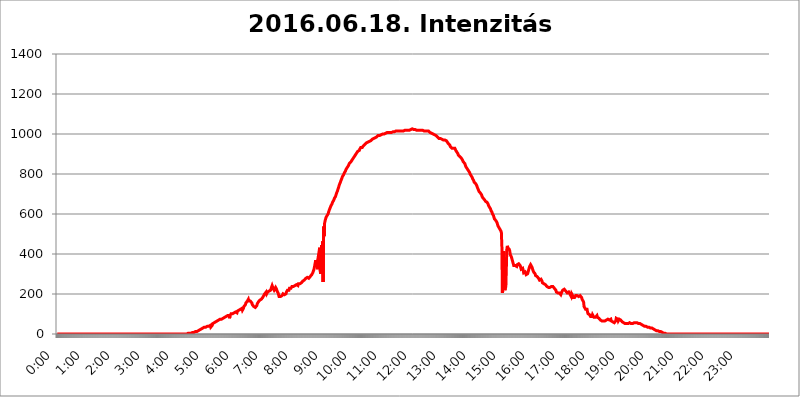
| Category | 2016.06.18. Intenzitás [W/m^2] |
|---|---|
| 0.0 | 0 |
| 0.0006944444444444445 | 0 |
| 0.001388888888888889 | 0 |
| 0.0020833333333333333 | 0 |
| 0.002777777777777778 | 0 |
| 0.003472222222222222 | 0 |
| 0.004166666666666667 | 0 |
| 0.004861111111111111 | 0 |
| 0.005555555555555556 | 0 |
| 0.0062499999999999995 | 0 |
| 0.006944444444444444 | 0 |
| 0.007638888888888889 | 0 |
| 0.008333333333333333 | 0 |
| 0.009027777777777779 | 0 |
| 0.009722222222222222 | 0 |
| 0.010416666666666666 | 0 |
| 0.011111111111111112 | 0 |
| 0.011805555555555555 | 0 |
| 0.012499999999999999 | 0 |
| 0.013194444444444444 | 0 |
| 0.013888888888888888 | 0 |
| 0.014583333333333332 | 0 |
| 0.015277777777777777 | 0 |
| 0.015972222222222224 | 0 |
| 0.016666666666666666 | 0 |
| 0.017361111111111112 | 0 |
| 0.018055555555555557 | 0 |
| 0.01875 | 0 |
| 0.019444444444444445 | 0 |
| 0.02013888888888889 | 0 |
| 0.020833333333333332 | 0 |
| 0.02152777777777778 | 0 |
| 0.022222222222222223 | 0 |
| 0.02291666666666667 | 0 |
| 0.02361111111111111 | 0 |
| 0.024305555555555556 | 0 |
| 0.024999999999999998 | 0 |
| 0.025694444444444447 | 0 |
| 0.02638888888888889 | 0 |
| 0.027083333333333334 | 0 |
| 0.027777777777777776 | 0 |
| 0.02847222222222222 | 0 |
| 0.029166666666666664 | 0 |
| 0.029861111111111113 | 0 |
| 0.030555555555555555 | 0 |
| 0.03125 | 0 |
| 0.03194444444444445 | 0 |
| 0.03263888888888889 | 0 |
| 0.03333333333333333 | 0 |
| 0.034027777777777775 | 0 |
| 0.034722222222222224 | 0 |
| 0.035416666666666666 | 0 |
| 0.036111111111111115 | 0 |
| 0.03680555555555556 | 0 |
| 0.0375 | 0 |
| 0.03819444444444444 | 0 |
| 0.03888888888888889 | 0 |
| 0.03958333333333333 | 0 |
| 0.04027777777777778 | 0 |
| 0.04097222222222222 | 0 |
| 0.041666666666666664 | 0 |
| 0.042361111111111106 | 0 |
| 0.04305555555555556 | 0 |
| 0.043750000000000004 | 0 |
| 0.044444444444444446 | 0 |
| 0.04513888888888889 | 0 |
| 0.04583333333333334 | 0 |
| 0.04652777777777778 | 0 |
| 0.04722222222222222 | 0 |
| 0.04791666666666666 | 0 |
| 0.04861111111111111 | 0 |
| 0.049305555555555554 | 0 |
| 0.049999999999999996 | 0 |
| 0.05069444444444445 | 0 |
| 0.051388888888888894 | 0 |
| 0.052083333333333336 | 0 |
| 0.05277777777777778 | 0 |
| 0.05347222222222222 | 0 |
| 0.05416666666666667 | 0 |
| 0.05486111111111111 | 0 |
| 0.05555555555555555 | 0 |
| 0.05625 | 0 |
| 0.05694444444444444 | 0 |
| 0.057638888888888885 | 0 |
| 0.05833333333333333 | 0 |
| 0.05902777777777778 | 0 |
| 0.059722222222222225 | 0 |
| 0.06041666666666667 | 0 |
| 0.061111111111111116 | 0 |
| 0.06180555555555556 | 0 |
| 0.0625 | 0 |
| 0.06319444444444444 | 0 |
| 0.06388888888888888 | 0 |
| 0.06458333333333334 | 0 |
| 0.06527777777777778 | 0 |
| 0.06597222222222222 | 0 |
| 0.06666666666666667 | 0 |
| 0.06736111111111111 | 0 |
| 0.06805555555555555 | 0 |
| 0.06874999999999999 | 0 |
| 0.06944444444444443 | 0 |
| 0.07013888888888889 | 0 |
| 0.07083333333333333 | 0 |
| 0.07152777777777779 | 0 |
| 0.07222222222222223 | 0 |
| 0.07291666666666667 | 0 |
| 0.07361111111111111 | 0 |
| 0.07430555555555556 | 0 |
| 0.075 | 0 |
| 0.07569444444444444 | 0 |
| 0.0763888888888889 | 0 |
| 0.07708333333333334 | 0 |
| 0.07777777777777778 | 0 |
| 0.07847222222222222 | 0 |
| 0.07916666666666666 | 0 |
| 0.0798611111111111 | 0 |
| 0.08055555555555556 | 0 |
| 0.08125 | 0 |
| 0.08194444444444444 | 0 |
| 0.08263888888888889 | 0 |
| 0.08333333333333333 | 0 |
| 0.08402777777777777 | 0 |
| 0.08472222222222221 | 0 |
| 0.08541666666666665 | 0 |
| 0.08611111111111112 | 0 |
| 0.08680555555555557 | 0 |
| 0.08750000000000001 | 0 |
| 0.08819444444444445 | 0 |
| 0.08888888888888889 | 0 |
| 0.08958333333333333 | 0 |
| 0.09027777777777778 | 0 |
| 0.09097222222222222 | 0 |
| 0.09166666666666667 | 0 |
| 0.09236111111111112 | 0 |
| 0.09305555555555556 | 0 |
| 0.09375 | 0 |
| 0.09444444444444444 | 0 |
| 0.09513888888888888 | 0 |
| 0.09583333333333333 | 0 |
| 0.09652777777777777 | 0 |
| 0.09722222222222222 | 0 |
| 0.09791666666666667 | 0 |
| 0.09861111111111111 | 0 |
| 0.09930555555555555 | 0 |
| 0.09999999999999999 | 0 |
| 0.10069444444444443 | 0 |
| 0.1013888888888889 | 0 |
| 0.10208333333333335 | 0 |
| 0.10277777777777779 | 0 |
| 0.10347222222222223 | 0 |
| 0.10416666666666667 | 0 |
| 0.10486111111111111 | 0 |
| 0.10555555555555556 | 0 |
| 0.10625 | 0 |
| 0.10694444444444444 | 0 |
| 0.1076388888888889 | 0 |
| 0.10833333333333334 | 0 |
| 0.10902777777777778 | 0 |
| 0.10972222222222222 | 0 |
| 0.1111111111111111 | 0 |
| 0.11180555555555556 | 0 |
| 0.11180555555555556 | 0 |
| 0.1125 | 0 |
| 0.11319444444444444 | 0 |
| 0.11388888888888889 | 0 |
| 0.11458333333333333 | 0 |
| 0.11527777777777777 | 0 |
| 0.11597222222222221 | 0 |
| 0.11666666666666665 | 0 |
| 0.1173611111111111 | 0 |
| 0.11805555555555557 | 0 |
| 0.11944444444444445 | 0 |
| 0.12013888888888889 | 0 |
| 0.12083333333333333 | 0 |
| 0.12152777777777778 | 0 |
| 0.12222222222222223 | 0 |
| 0.12291666666666667 | 0 |
| 0.12291666666666667 | 0 |
| 0.12361111111111112 | 0 |
| 0.12430555555555556 | 0 |
| 0.125 | 0 |
| 0.12569444444444444 | 0 |
| 0.12638888888888888 | 0 |
| 0.12708333333333333 | 0 |
| 0.16875 | 0 |
| 0.12847222222222224 | 0 |
| 0.12916666666666668 | 0 |
| 0.12986111111111112 | 0 |
| 0.13055555555555556 | 0 |
| 0.13125 | 0 |
| 0.13194444444444445 | 0 |
| 0.1326388888888889 | 0 |
| 0.13333333333333333 | 0 |
| 0.13402777777777777 | 0 |
| 0.13402777777777777 | 0 |
| 0.13472222222222222 | 0 |
| 0.13541666666666666 | 0 |
| 0.1361111111111111 | 0 |
| 0.13749999999999998 | 0 |
| 0.13819444444444443 | 0 |
| 0.1388888888888889 | 0 |
| 0.13958333333333334 | 0 |
| 0.14027777777777778 | 0 |
| 0.14097222222222222 | 0 |
| 0.14166666666666666 | 0 |
| 0.1423611111111111 | 0 |
| 0.14305555555555557 | 0 |
| 0.14375000000000002 | 0 |
| 0.14444444444444446 | 0 |
| 0.1451388888888889 | 0 |
| 0.1451388888888889 | 0 |
| 0.14652777777777778 | 0 |
| 0.14722222222222223 | 0 |
| 0.14791666666666667 | 0 |
| 0.1486111111111111 | 0 |
| 0.14930555555555555 | 0 |
| 0.15 | 0 |
| 0.15069444444444444 | 0 |
| 0.15138888888888888 | 0 |
| 0.15208333333333332 | 0 |
| 0.15277777777777776 | 0 |
| 0.15347222222222223 | 0 |
| 0.15416666666666667 | 0 |
| 0.15486111111111112 | 0 |
| 0.15555555555555556 | 0 |
| 0.15625 | 0 |
| 0.15694444444444444 | 0 |
| 0.15763888888888888 | 0 |
| 0.15833333333333333 | 0 |
| 0.15902777777777777 | 0 |
| 0.15972222222222224 | 0 |
| 0.16041666666666668 | 0 |
| 0.16111111111111112 | 0 |
| 0.16180555555555556 | 0 |
| 0.1625 | 0 |
| 0.16319444444444445 | 0 |
| 0.1638888888888889 | 0 |
| 0.16458333333333333 | 0 |
| 0.16527777777777777 | 0 |
| 0.16597222222222222 | 0 |
| 0.16666666666666666 | 0 |
| 0.1673611111111111 | 0 |
| 0.16805555555555554 | 0 |
| 0.16874999999999998 | 0 |
| 0.16944444444444443 | 0 |
| 0.17013888888888887 | 0 |
| 0.1708333333333333 | 0 |
| 0.17152777777777775 | 0 |
| 0.17222222222222225 | 0 |
| 0.1729166666666667 | 0 |
| 0.17361111111111113 | 0 |
| 0.17430555555555557 | 0 |
| 0.17500000000000002 | 0 |
| 0.17569444444444446 | 0 |
| 0.1763888888888889 | 0 |
| 0.17708333333333334 | 0 |
| 0.17777777777777778 | 0 |
| 0.17847222222222223 | 0 |
| 0.17916666666666667 | 0 |
| 0.1798611111111111 | 0 |
| 0.18055555555555555 | 0 |
| 0.18125 | 0 |
| 0.18194444444444444 | 0 |
| 0.1826388888888889 | 0 |
| 0.18333333333333335 | 3.525 |
| 0.1840277777777778 | 3.525 |
| 0.18472222222222223 | 3.525 |
| 0.18541666666666667 | 3.525 |
| 0.18611111111111112 | 3.525 |
| 0.18680555555555556 | 3.525 |
| 0.1875 | 3.525 |
| 0.18819444444444444 | 3.525 |
| 0.18888888888888888 | 3.525 |
| 0.18958333333333333 | 7.887 |
| 0.19027777777777777 | 7.887 |
| 0.1909722222222222 | 7.887 |
| 0.19166666666666665 | 7.887 |
| 0.19236111111111112 | 7.887 |
| 0.19305555555555554 | 12.257 |
| 0.19375 | 12.257 |
| 0.19444444444444445 | 12.257 |
| 0.1951388888888889 | 12.257 |
| 0.19583333333333333 | 12.257 |
| 0.19652777777777777 | 12.257 |
| 0.19722222222222222 | 12.257 |
| 0.19791666666666666 | 16.636 |
| 0.1986111111111111 | 16.636 |
| 0.19930555555555554 | 21.024 |
| 0.19999999999999998 | 21.024 |
| 0.20069444444444443 | 21.024 |
| 0.20138888888888887 | 21.024 |
| 0.2020833333333333 | 25.419 |
| 0.2027777777777778 | 25.419 |
| 0.2034722222222222 | 29.823 |
| 0.2041666666666667 | 29.823 |
| 0.20486111111111113 | 29.823 |
| 0.20555555555555557 | 29.823 |
| 0.20625000000000002 | 34.234 |
| 0.20694444444444446 | 34.234 |
| 0.2076388888888889 | 34.234 |
| 0.20833333333333334 | 34.234 |
| 0.20902777777777778 | 34.234 |
| 0.20972222222222223 | 38.653 |
| 0.21041666666666667 | 38.653 |
| 0.2111111111111111 | 38.653 |
| 0.21180555555555555 | 43.079 |
| 0.2125 | 38.653 |
| 0.21319444444444444 | 43.079 |
| 0.2138888888888889 | 43.079 |
| 0.21458333333333335 | 43.079 |
| 0.2152777777777778 | 34.234 |
| 0.21597222222222223 | 34.234 |
| 0.21666666666666667 | 34.234 |
| 0.21736111111111112 | 43.079 |
| 0.21805555555555556 | 51.951 |
| 0.21875 | 56.398 |
| 0.21944444444444444 | 56.398 |
| 0.22013888888888888 | 56.398 |
| 0.22083333333333333 | 56.398 |
| 0.22152777777777777 | 60.85 |
| 0.2222222222222222 | 60.85 |
| 0.22291666666666665 | 60.85 |
| 0.2236111111111111 | 65.31 |
| 0.22430555555555556 | 65.31 |
| 0.225 | 65.31 |
| 0.22569444444444445 | 65.31 |
| 0.2263888888888889 | 69.775 |
| 0.22708333333333333 | 69.775 |
| 0.22777777777777777 | 74.246 |
| 0.22847222222222222 | 74.246 |
| 0.22916666666666666 | 74.246 |
| 0.2298611111111111 | 74.246 |
| 0.23055555555555554 | 74.246 |
| 0.23124999999999998 | 78.722 |
| 0.23194444444444443 | 78.722 |
| 0.23263888888888887 | 78.722 |
| 0.2333333333333333 | 83.205 |
| 0.2340277777777778 | 83.205 |
| 0.2347222222222222 | 83.205 |
| 0.2354166666666667 | 83.205 |
| 0.23611111111111113 | 87.692 |
| 0.23680555555555557 | 87.692 |
| 0.23750000000000002 | 87.692 |
| 0.23819444444444446 | 87.692 |
| 0.2388888888888889 | 92.184 |
| 0.23958333333333334 | 92.184 |
| 0.24027777777777778 | 92.184 |
| 0.24097222222222223 | 92.184 |
| 0.24166666666666667 | 78.722 |
| 0.2423611111111111 | 92.184 |
| 0.24305555555555555 | 96.682 |
| 0.24375 | 101.184 |
| 0.24444444444444446 | 101.184 |
| 0.24513888888888888 | 101.184 |
| 0.24583333333333335 | 101.184 |
| 0.2465277777777778 | 101.184 |
| 0.24722222222222223 | 105.69 |
| 0.24791666666666667 | 105.69 |
| 0.24861111111111112 | 105.69 |
| 0.24930555555555556 | 110.201 |
| 0.25 | 110.201 |
| 0.25069444444444444 | 110.201 |
| 0.2513888888888889 | 110.201 |
| 0.2520833333333333 | 105.69 |
| 0.25277777777777777 | 114.716 |
| 0.2534722222222222 | 114.716 |
| 0.25416666666666665 | 119.235 |
| 0.2548611111111111 | 119.235 |
| 0.2555555555555556 | 119.235 |
| 0.25625000000000003 | 123.758 |
| 0.2569444444444445 | 123.758 |
| 0.2576388888888889 | 128.284 |
| 0.25833333333333336 | 128.284 |
| 0.2590277777777778 | 128.284 |
| 0.25972222222222224 | 119.235 |
| 0.2604166666666667 | 123.758 |
| 0.2611111111111111 | 128.284 |
| 0.26180555555555557 | 137.347 |
| 0.2625 | 141.884 |
| 0.26319444444444445 | 141.884 |
| 0.2638888888888889 | 146.423 |
| 0.26458333333333334 | 155.509 |
| 0.2652777777777778 | 155.509 |
| 0.2659722222222222 | 160.056 |
| 0.26666666666666666 | 164.605 |
| 0.2673611111111111 | 169.156 |
| 0.26805555555555555 | 173.709 |
| 0.26875 | 164.605 |
| 0.26944444444444443 | 164.605 |
| 0.2701388888888889 | 164.605 |
| 0.2708333333333333 | 164.605 |
| 0.27152777777777776 | 164.605 |
| 0.2722222222222222 | 160.056 |
| 0.27291666666666664 | 155.509 |
| 0.2736111111111111 | 146.423 |
| 0.2743055555555555 | 146.423 |
| 0.27499999999999997 | 141.884 |
| 0.27569444444444446 | 137.347 |
| 0.27638888888888885 | 132.814 |
| 0.27708333333333335 | 137.347 |
| 0.2777777777777778 | 132.814 |
| 0.27847222222222223 | 132.814 |
| 0.2791666666666667 | 137.347 |
| 0.2798611111111111 | 141.884 |
| 0.28055555555555556 | 150.964 |
| 0.28125 | 155.509 |
| 0.28194444444444444 | 160.056 |
| 0.2826388888888889 | 164.605 |
| 0.2833333333333333 | 164.605 |
| 0.28402777777777777 | 169.156 |
| 0.2847222222222222 | 169.156 |
| 0.28541666666666665 | 173.709 |
| 0.28611111111111115 | 173.709 |
| 0.28680555555555554 | 178.264 |
| 0.28750000000000003 | 178.264 |
| 0.2881944444444445 | 182.82 |
| 0.2888888888888889 | 187.378 |
| 0.28958333333333336 | 191.937 |
| 0.2902777777777778 | 196.497 |
| 0.29097222222222224 | 201.058 |
| 0.2916666666666667 | 205.62 |
| 0.2923611111111111 | 205.62 |
| 0.29305555555555557 | 210.182 |
| 0.29375 | 201.058 |
| 0.29444444444444445 | 196.497 |
| 0.2951388888888889 | 210.182 |
| 0.29583333333333334 | 210.182 |
| 0.2965277777777778 | 214.746 |
| 0.2972222222222222 | 214.746 |
| 0.29791666666666666 | 210.182 |
| 0.2986111111111111 | 214.746 |
| 0.29930555555555555 | 219.309 |
| 0.3 | 228.436 |
| 0.30069444444444443 | 233 |
| 0.3013888888888889 | 242.127 |
| 0.3020833333333333 | 237.564 |
| 0.30277777777777776 | 228.436 |
| 0.3034722222222222 | 228.436 |
| 0.30416666666666664 | 219.309 |
| 0.3048611111111111 | 219.309 |
| 0.3055555555555555 | 219.309 |
| 0.30624999999999997 | 233 |
| 0.3069444444444444 | 228.436 |
| 0.3076388888888889 | 223.873 |
| 0.30833333333333335 | 214.746 |
| 0.3090277777777778 | 210.182 |
| 0.30972222222222223 | 205.62 |
| 0.3104166666666667 | 201.058 |
| 0.3111111111111111 | 187.378 |
| 0.31180555555555556 | 182.82 |
| 0.3125 | 182.82 |
| 0.31319444444444444 | 187.378 |
| 0.3138888888888889 | 182.82 |
| 0.3145833333333333 | 187.378 |
| 0.31527777777777777 | 191.937 |
| 0.3159722222222222 | 196.497 |
| 0.31666666666666665 | 201.058 |
| 0.31736111111111115 | 201.058 |
| 0.31805555555555554 | 196.497 |
| 0.31875000000000003 | 196.497 |
| 0.3194444444444445 | 191.937 |
| 0.3201388888888889 | 201.058 |
| 0.32083333333333336 | 201.058 |
| 0.3215277777777778 | 210.182 |
| 0.32222222222222224 | 214.746 |
| 0.3229166666666667 | 219.309 |
| 0.3236111111111111 | 219.309 |
| 0.32430555555555557 | 219.309 |
| 0.325 | 219.309 |
| 0.32569444444444445 | 228.436 |
| 0.3263888888888889 | 223.873 |
| 0.32708333333333334 | 228.436 |
| 0.3277777777777778 | 228.436 |
| 0.3284722222222222 | 233 |
| 0.32916666666666666 | 237.564 |
| 0.3298611111111111 | 237.564 |
| 0.33055555555555555 | 237.564 |
| 0.33125 | 237.564 |
| 0.33194444444444443 | 242.127 |
| 0.3326388888888889 | 242.127 |
| 0.3333333333333333 | 242.127 |
| 0.3340277777777778 | 242.127 |
| 0.3347222222222222 | 242.127 |
| 0.3354166666666667 | 246.689 |
| 0.3361111111111111 | 246.689 |
| 0.3368055555555556 | 246.689 |
| 0.33749999999999997 | 242.127 |
| 0.33819444444444446 | 251.251 |
| 0.33888888888888885 | 251.251 |
| 0.33958333333333335 | 251.251 |
| 0.34027777777777773 | 251.251 |
| 0.34097222222222223 | 255.813 |
| 0.3416666666666666 | 255.813 |
| 0.3423611111111111 | 255.813 |
| 0.3430555555555555 | 260.373 |
| 0.34375 | 260.373 |
| 0.3444444444444445 | 264.932 |
| 0.3451388888888889 | 264.932 |
| 0.3458333333333334 | 269.49 |
| 0.34652777777777777 | 269.49 |
| 0.34722222222222227 | 269.49 |
| 0.34791666666666665 | 274.047 |
| 0.34861111111111115 | 278.603 |
| 0.34930555555555554 | 278.603 |
| 0.35000000000000003 | 278.603 |
| 0.3506944444444444 | 283.156 |
| 0.3513888888888889 | 278.603 |
| 0.3520833333333333 | 283.156 |
| 0.3527777777777778 | 278.603 |
| 0.3534722222222222 | 283.156 |
| 0.3541666666666667 | 283.156 |
| 0.3548611111111111 | 287.709 |
| 0.35555555555555557 | 287.709 |
| 0.35625 | 292.259 |
| 0.35694444444444445 | 296.808 |
| 0.3576388888888889 | 296.808 |
| 0.35833333333333334 | 305.898 |
| 0.3590277777777778 | 310.44 |
| 0.3597222222222222 | 319.517 |
| 0.36041666666666666 | 328.584 |
| 0.3611111111111111 | 342.162 |
| 0.36180555555555555 | 355.712 |
| 0.3625 | 369.23 |
| 0.36319444444444443 | 369.23 |
| 0.3638888888888889 | 364.728 |
| 0.3645833333333333 | 337.639 |
| 0.3652777777777778 | 324.052 |
| 0.3659722222222222 | 382.715 |
| 0.3666666666666667 | 400.638 |
| 0.3673611111111111 | 414.035 |
| 0.3680555555555556 | 431.833 |
| 0.36874999999999997 | 314.98 |
| 0.36944444444444446 | 301.354 |
| 0.37013888888888885 | 355.712 |
| 0.37083333333333335 | 445.129 |
| 0.37152777777777773 | 422.943 |
| 0.37222222222222223 | 462.786 |
| 0.3729166666666666 | 260.373 |
| 0.3736111111111111 | 536.82 |
| 0.3743055555555555 | 489.108 |
| 0.375 | 553.986 |
| 0.3756944444444445 | 566.793 |
| 0.3763888888888889 | 575.299 |
| 0.3770833333333334 | 583.779 |
| 0.37777777777777777 | 588.009 |
| 0.37847222222222227 | 592.233 |
| 0.37916666666666665 | 596.45 |
| 0.37986111111111115 | 600.661 |
| 0.38055555555555554 | 609.062 |
| 0.38125000000000003 | 617.436 |
| 0.3819444444444444 | 621.613 |
| 0.3826388888888889 | 629.948 |
| 0.3833333333333333 | 634.105 |
| 0.3840277777777778 | 642.4 |
| 0.3847222222222222 | 646.537 |
| 0.3854166666666667 | 650.667 |
| 0.3861111111111111 | 658.909 |
| 0.38680555555555557 | 658.909 |
| 0.3875 | 667.123 |
| 0.38819444444444445 | 671.22 |
| 0.3888888888888889 | 679.395 |
| 0.38958333333333334 | 683.473 |
| 0.3902777777777778 | 687.544 |
| 0.3909722222222222 | 695.666 |
| 0.39166666666666666 | 703.762 |
| 0.3923611111111111 | 707.8 |
| 0.39305555555555555 | 715.858 |
| 0.39375 | 723.889 |
| 0.39444444444444443 | 731.896 |
| 0.3951388888888889 | 739.877 |
| 0.3958333333333333 | 747.834 |
| 0.3965277777777778 | 751.803 |
| 0.3972222222222222 | 759.723 |
| 0.3979166666666667 | 767.62 |
| 0.3986111111111111 | 771.559 |
| 0.3993055555555556 | 779.42 |
| 0.39999999999999997 | 787.258 |
| 0.40069444444444446 | 791.169 |
| 0.40138888888888885 | 795.074 |
| 0.40208333333333335 | 798.974 |
| 0.40277777777777773 | 806.757 |
| 0.40347222222222223 | 810.641 |
| 0.4041666666666666 | 814.519 |
| 0.4048611111111111 | 822.26 |
| 0.4055555555555555 | 826.123 |
| 0.40625 | 826.123 |
| 0.4069444444444445 | 833.834 |
| 0.4076388888888889 | 837.682 |
| 0.4083333333333334 | 841.526 |
| 0.40902777777777777 | 845.365 |
| 0.40972222222222227 | 853.029 |
| 0.41041666666666665 | 853.029 |
| 0.41111111111111115 | 856.855 |
| 0.41180555555555554 | 860.676 |
| 0.41250000000000003 | 864.493 |
| 0.4131944444444444 | 868.305 |
| 0.4138888888888889 | 872.114 |
| 0.4145833333333333 | 875.918 |
| 0.4152777777777778 | 879.719 |
| 0.4159722222222222 | 883.516 |
| 0.4166666666666667 | 887.309 |
| 0.4173611111111111 | 891.099 |
| 0.41805555555555557 | 894.885 |
| 0.41875 | 898.668 |
| 0.41944444444444445 | 902.447 |
| 0.4201388888888889 | 906.223 |
| 0.42083333333333334 | 909.996 |
| 0.4215277777777778 | 913.766 |
| 0.4222222222222222 | 913.766 |
| 0.42291666666666666 | 917.534 |
| 0.4236111111111111 | 917.534 |
| 0.42430555555555555 | 925.06 |
| 0.425 | 928.819 |
| 0.42569444444444443 | 932.576 |
| 0.4263888888888889 | 932.576 |
| 0.4270833333333333 | 932.576 |
| 0.4277777777777778 | 932.576 |
| 0.4284722222222222 | 936.33 |
| 0.4291666666666667 | 940.082 |
| 0.4298611111111111 | 940.082 |
| 0.4305555555555556 | 943.832 |
| 0.43124999999999997 | 947.58 |
| 0.43194444444444446 | 947.58 |
| 0.43263888888888885 | 951.327 |
| 0.43333333333333335 | 955.071 |
| 0.43402777777777773 | 955.071 |
| 0.43472222222222223 | 955.071 |
| 0.4354166666666666 | 958.814 |
| 0.4361111111111111 | 958.814 |
| 0.4368055555555555 | 962.555 |
| 0.4375 | 962.555 |
| 0.4381944444444445 | 966.295 |
| 0.4388888888888889 | 966.295 |
| 0.4395833333333334 | 966.295 |
| 0.44027777777777777 | 970.034 |
| 0.44097222222222227 | 970.034 |
| 0.44166666666666665 | 973.772 |
| 0.44236111111111115 | 973.772 |
| 0.44305555555555554 | 973.772 |
| 0.44375000000000003 | 977.508 |
| 0.4444444444444444 | 981.244 |
| 0.4451388888888889 | 981.244 |
| 0.4458333333333333 | 981.244 |
| 0.4465277777777778 | 981.244 |
| 0.4472222222222222 | 984.98 |
| 0.4479166666666667 | 984.98 |
| 0.4486111111111111 | 988.714 |
| 0.44930555555555557 | 988.714 |
| 0.45 | 992.448 |
| 0.45069444444444445 | 992.448 |
| 0.4513888888888889 | 992.448 |
| 0.45208333333333334 | 992.448 |
| 0.4527777777777778 | 992.448 |
| 0.4534722222222222 | 992.448 |
| 0.45416666666666666 | 996.182 |
| 0.4548611111111111 | 996.182 |
| 0.45555555555555555 | 996.182 |
| 0.45625 | 999.916 |
| 0.45694444444444443 | 999.916 |
| 0.4576388888888889 | 999.916 |
| 0.4583333333333333 | 999.916 |
| 0.4590277777777778 | 1003.65 |
| 0.4597222222222222 | 1003.65 |
| 0.4604166666666667 | 1003.65 |
| 0.4611111111111111 | 1003.65 |
| 0.4618055555555556 | 1003.65 |
| 0.46249999999999997 | 1007.383 |
| 0.46319444444444446 | 1007.383 |
| 0.46388888888888885 | 1007.383 |
| 0.46458333333333335 | 1007.383 |
| 0.46527777777777773 | 1007.383 |
| 0.46597222222222223 | 1007.383 |
| 0.4666666666666666 | 1007.383 |
| 0.4673611111111111 | 1007.383 |
| 0.4680555555555555 | 1007.383 |
| 0.46875 | 1007.383 |
| 0.4694444444444445 | 1011.118 |
| 0.4701388888888889 | 1011.118 |
| 0.4708333333333334 | 1011.118 |
| 0.47152777777777777 | 1011.118 |
| 0.47222222222222227 | 1011.118 |
| 0.47291666666666665 | 1011.118 |
| 0.47361111111111115 | 1011.118 |
| 0.47430555555555554 | 1014.852 |
| 0.47500000000000003 | 1014.852 |
| 0.4756944444444444 | 1014.852 |
| 0.4763888888888889 | 1014.852 |
| 0.4770833333333333 | 1014.852 |
| 0.4777777777777778 | 1014.852 |
| 0.4784722222222222 | 1014.852 |
| 0.4791666666666667 | 1014.852 |
| 0.4798611111111111 | 1014.852 |
| 0.48055555555555557 | 1014.852 |
| 0.48125 | 1014.852 |
| 0.48194444444444445 | 1014.852 |
| 0.4826388888888889 | 1014.852 |
| 0.48333333333333334 | 1014.852 |
| 0.4840277777777778 | 1014.852 |
| 0.4847222222222222 | 1014.852 |
| 0.48541666666666666 | 1014.852 |
| 0.4861111111111111 | 1014.852 |
| 0.48680555555555555 | 1018.587 |
| 0.4875 | 1018.587 |
| 0.48819444444444443 | 1018.587 |
| 0.4888888888888889 | 1018.587 |
| 0.4895833333333333 | 1018.587 |
| 0.4902777777777778 | 1018.587 |
| 0.4909722222222222 | 1018.587 |
| 0.4916666666666667 | 1018.587 |
| 0.4923611111111111 | 1018.587 |
| 0.4930555555555556 | 1018.587 |
| 0.49374999999999997 | 1018.587 |
| 0.49444444444444446 | 1022.323 |
| 0.49513888888888885 | 1022.323 |
| 0.49583333333333335 | 1022.323 |
| 0.49652777777777773 | 1026.06 |
| 0.49722222222222223 | 1026.06 |
| 0.4979166666666666 | 1026.06 |
| 0.4986111111111111 | 1026.06 |
| 0.4993055555555555 | 1026.06 |
| 0.5 | 1022.323 |
| 0.5006944444444444 | 1022.323 |
| 0.5013888888888889 | 1022.323 |
| 0.5020833333333333 | 1022.323 |
| 0.5027777777777778 | 1022.323 |
| 0.5034722222222222 | 1018.587 |
| 0.5041666666666667 | 1018.587 |
| 0.5048611111111111 | 1018.587 |
| 0.5055555555555555 | 1018.587 |
| 0.50625 | 1018.587 |
| 0.5069444444444444 | 1018.587 |
| 0.5076388888888889 | 1018.587 |
| 0.5083333333333333 | 1018.587 |
| 0.5090277777777777 | 1014.852 |
| 0.5097222222222222 | 1018.587 |
| 0.5104166666666666 | 1018.587 |
| 0.5111111111111112 | 1018.587 |
| 0.5118055555555555 | 1018.587 |
| 0.5125000000000001 | 1018.587 |
| 0.5131944444444444 | 1018.587 |
| 0.513888888888889 | 1014.852 |
| 0.5145833333333333 | 1014.852 |
| 0.5152777777777778 | 1014.852 |
| 0.5159722222222222 | 1014.852 |
| 0.5166666666666667 | 1014.852 |
| 0.517361111111111 | 1018.587 |
| 0.5180555555555556 | 1018.587 |
| 0.5187499999999999 | 1014.852 |
| 0.5194444444444445 | 1018.587 |
| 0.5201388888888888 | 1014.852 |
| 0.5208333333333334 | 1014.852 |
| 0.5215277777777778 | 1011.118 |
| 0.5222222222222223 | 1011.118 |
| 0.5229166666666667 | 1007.383 |
| 0.5236111111111111 | 1007.383 |
| 0.5243055555555556 | 1003.65 |
| 0.525 | 1003.65 |
| 0.5256944444444445 | 1003.65 |
| 0.5263888888888889 | 1003.65 |
| 0.5270833333333333 | 999.916 |
| 0.5277777777777778 | 999.916 |
| 0.5284722222222222 | 996.182 |
| 0.5291666666666667 | 996.182 |
| 0.5298611111111111 | 996.182 |
| 0.5305555555555556 | 996.182 |
| 0.53125 | 992.448 |
| 0.5319444444444444 | 988.714 |
| 0.5326388888888889 | 988.714 |
| 0.5333333333333333 | 984.98 |
| 0.5340277777777778 | 981.244 |
| 0.5347222222222222 | 981.244 |
| 0.5354166666666667 | 977.508 |
| 0.5361111111111111 | 977.508 |
| 0.5368055555555555 | 977.508 |
| 0.5375 | 977.508 |
| 0.5381944444444444 | 977.508 |
| 0.5388888888888889 | 977.508 |
| 0.5395833333333333 | 973.772 |
| 0.5402777777777777 | 973.772 |
| 0.5409722222222222 | 970.034 |
| 0.5416666666666666 | 970.034 |
| 0.5423611111111112 | 970.034 |
| 0.5430555555555555 | 970.034 |
| 0.5437500000000001 | 970.034 |
| 0.5444444444444444 | 970.034 |
| 0.545138888888889 | 970.034 |
| 0.5458333333333333 | 966.295 |
| 0.5465277777777778 | 962.555 |
| 0.5472222222222222 | 958.814 |
| 0.5479166666666667 | 955.071 |
| 0.548611111111111 | 951.327 |
| 0.5493055555555556 | 947.58 |
| 0.5499999999999999 | 947.58 |
| 0.5506944444444445 | 943.832 |
| 0.5513888888888888 | 936.33 |
| 0.5520833333333334 | 932.576 |
| 0.5527777777777778 | 932.576 |
| 0.5534722222222223 | 928.819 |
| 0.5541666666666667 | 928.819 |
| 0.5548611111111111 | 928.819 |
| 0.5555555555555556 | 928.819 |
| 0.55625 | 928.819 |
| 0.5569444444444445 | 928.819 |
| 0.5576388888888889 | 928.819 |
| 0.5583333333333333 | 925.06 |
| 0.5590277777777778 | 917.534 |
| 0.5597222222222222 | 913.766 |
| 0.5604166666666667 | 909.996 |
| 0.5611111111111111 | 906.223 |
| 0.5618055555555556 | 902.447 |
| 0.5625 | 894.885 |
| 0.5631944444444444 | 891.099 |
| 0.5638888888888889 | 891.099 |
| 0.5645833333333333 | 887.309 |
| 0.5652777777777778 | 883.516 |
| 0.5659722222222222 | 883.516 |
| 0.5666666666666667 | 879.719 |
| 0.5673611111111111 | 875.918 |
| 0.5680555555555555 | 872.114 |
| 0.56875 | 868.305 |
| 0.5694444444444444 | 860.676 |
| 0.5701388888888889 | 860.676 |
| 0.5708333333333333 | 856.855 |
| 0.5715277777777777 | 853.029 |
| 0.5722222222222222 | 845.365 |
| 0.5729166666666666 | 837.682 |
| 0.5736111111111112 | 833.834 |
| 0.5743055555555555 | 829.981 |
| 0.5750000000000001 | 826.123 |
| 0.5756944444444444 | 822.26 |
| 0.576388888888889 | 818.392 |
| 0.5770833333333333 | 814.519 |
| 0.5777777777777778 | 810.641 |
| 0.5784722222222222 | 806.757 |
| 0.5791666666666667 | 798.974 |
| 0.579861111111111 | 795.074 |
| 0.5805555555555556 | 791.169 |
| 0.5812499999999999 | 787.258 |
| 0.5819444444444445 | 783.342 |
| 0.5826388888888888 | 775.492 |
| 0.5833333333333334 | 771.559 |
| 0.5840277777777778 | 767.62 |
| 0.5847222222222223 | 759.723 |
| 0.5854166666666667 | 755.766 |
| 0.5861111111111111 | 755.766 |
| 0.5868055555555556 | 751.803 |
| 0.5875 | 747.834 |
| 0.5881944444444445 | 743.859 |
| 0.5888888888888889 | 735.89 |
| 0.5895833333333333 | 731.896 |
| 0.5902777777777778 | 723.889 |
| 0.5909722222222222 | 719.877 |
| 0.5916666666666667 | 711.832 |
| 0.5923611111111111 | 711.832 |
| 0.5930555555555556 | 707.8 |
| 0.59375 | 703.762 |
| 0.5944444444444444 | 699.717 |
| 0.5951388888888889 | 695.666 |
| 0.5958333333333333 | 687.544 |
| 0.5965277777777778 | 683.473 |
| 0.5972222222222222 | 679.395 |
| 0.5979166666666667 | 679.395 |
| 0.5986111111111111 | 675.311 |
| 0.5993055555555555 | 671.22 |
| 0.6 | 667.123 |
| 0.6006944444444444 | 663.019 |
| 0.6013888888888889 | 663.019 |
| 0.6020833333333333 | 658.909 |
| 0.6027777777777777 | 658.909 |
| 0.6034722222222222 | 658.909 |
| 0.6041666666666666 | 650.667 |
| 0.6048611111111112 | 642.4 |
| 0.6055555555555555 | 638.256 |
| 0.6062500000000001 | 634.105 |
| 0.6069444444444444 | 629.948 |
| 0.607638888888889 | 625.784 |
| 0.6083333333333333 | 617.436 |
| 0.6090277777777778 | 613.252 |
| 0.6097222222222222 | 609.062 |
| 0.6104166666666667 | 600.661 |
| 0.611111111111111 | 596.45 |
| 0.6118055555555556 | 592.233 |
| 0.6124999999999999 | 583.779 |
| 0.6131944444444445 | 575.299 |
| 0.6138888888888888 | 575.299 |
| 0.6145833333333334 | 571.049 |
| 0.6152777777777778 | 566.793 |
| 0.6159722222222223 | 566.793 |
| 0.6166666666666667 | 558.261 |
| 0.6173611111111111 | 549.704 |
| 0.6180555555555556 | 541.121 |
| 0.61875 | 536.82 |
| 0.6194444444444445 | 532.513 |
| 0.6201388888888889 | 532.513 |
| 0.6208333333333333 | 523.88 |
| 0.6215277777777778 | 519.555 |
| 0.6222222222222222 | 515.223 |
| 0.6229166666666667 | 506.542 |
| 0.6236111111111111 | 436.27 |
| 0.6243055555555556 | 205.62 |
| 0.625 | 219.309 |
| 0.6256944444444444 | 296.808 |
| 0.6263888888888889 | 414.035 |
| 0.6270833333333333 | 246.689 |
| 0.6277777777777778 | 219.309 |
| 0.6284722222222222 | 228.436 |
| 0.6291666666666667 | 237.564 |
| 0.6298611111111111 | 237.564 |
| 0.6305555555555555 | 422.943 |
| 0.63125 | 440.702 |
| 0.6319444444444444 | 431.833 |
| 0.6326388888888889 | 431.833 |
| 0.6333333333333333 | 431.833 |
| 0.6340277777777777 | 422.943 |
| 0.6347222222222222 | 414.035 |
| 0.6354166666666666 | 396.164 |
| 0.6361111111111112 | 391.685 |
| 0.6368055555555555 | 387.202 |
| 0.6375000000000001 | 382.715 |
| 0.6381944444444444 | 369.23 |
| 0.638888888888889 | 360.221 |
| 0.6395833333333333 | 351.198 |
| 0.6402777777777778 | 342.162 |
| 0.6409722222222222 | 342.162 |
| 0.6416666666666667 | 342.162 |
| 0.642361111111111 | 342.162 |
| 0.6430555555555556 | 342.162 |
| 0.6437499999999999 | 337.639 |
| 0.6444444444444445 | 337.639 |
| 0.6451388888888888 | 346.682 |
| 0.6458333333333334 | 351.198 |
| 0.6465277777777778 | 351.198 |
| 0.6472222222222223 | 351.198 |
| 0.6479166666666667 | 346.682 |
| 0.6486111111111111 | 351.198 |
| 0.6493055555555556 | 342.162 |
| 0.65 | 333.113 |
| 0.6506944444444445 | 324.052 |
| 0.6513888888888889 | 324.052 |
| 0.6520833333333333 | 324.052 |
| 0.6527777777777778 | 328.584 |
| 0.6534722222222222 | 319.517 |
| 0.6541666666666667 | 305.898 |
| 0.6548611111111111 | 305.898 |
| 0.6555555555555556 | 305.898 |
| 0.65625 | 310.44 |
| 0.6569444444444444 | 305.898 |
| 0.6576388888888889 | 296.808 |
| 0.6583333333333333 | 296.808 |
| 0.6590277777777778 | 296.808 |
| 0.6597222222222222 | 301.354 |
| 0.6604166666666667 | 305.898 |
| 0.6611111111111111 | 319.517 |
| 0.6618055555555555 | 328.584 |
| 0.6625 | 337.639 |
| 0.6631944444444444 | 342.162 |
| 0.6638888888888889 | 346.682 |
| 0.6645833333333333 | 351.198 |
| 0.6652777777777777 | 346.682 |
| 0.6659722222222222 | 333.113 |
| 0.6666666666666666 | 324.052 |
| 0.6673611111111111 | 319.517 |
| 0.6680555555555556 | 310.44 |
| 0.6687500000000001 | 305.898 |
| 0.6694444444444444 | 305.898 |
| 0.6701388888888888 | 301.354 |
| 0.6708333333333334 | 292.259 |
| 0.6715277777777778 | 287.709 |
| 0.6722222222222222 | 287.709 |
| 0.6729166666666666 | 287.709 |
| 0.6736111111111112 | 287.709 |
| 0.6743055555555556 | 283.156 |
| 0.6749999999999999 | 278.603 |
| 0.6756944444444444 | 274.047 |
| 0.6763888888888889 | 269.49 |
| 0.6770833333333334 | 269.49 |
| 0.6777777777777777 | 269.49 |
| 0.6784722222222223 | 274.047 |
| 0.6791666666666667 | 274.047 |
| 0.6798611111111111 | 264.932 |
| 0.6805555555555555 | 255.813 |
| 0.68125 | 255.813 |
| 0.6819444444444445 | 251.251 |
| 0.6826388888888889 | 251.251 |
| 0.6833333333333332 | 251.251 |
| 0.6840277777777778 | 246.689 |
| 0.6847222222222222 | 246.689 |
| 0.6854166666666667 | 242.127 |
| 0.686111111111111 | 242.127 |
| 0.6868055555555556 | 237.564 |
| 0.6875 | 237.564 |
| 0.6881944444444444 | 237.564 |
| 0.688888888888889 | 233 |
| 0.6895833333333333 | 233 |
| 0.6902777777777778 | 233 |
| 0.6909722222222222 | 233 |
| 0.6916666666666668 | 233 |
| 0.6923611111111111 | 237.564 |
| 0.6930555555555555 | 237.564 |
| 0.69375 | 237.564 |
| 0.6944444444444445 | 237.564 |
| 0.6951388888888889 | 237.564 |
| 0.6958333333333333 | 233 |
| 0.6965277777777777 | 233 |
| 0.6972222222222223 | 228.436 |
| 0.6979166666666666 | 228.436 |
| 0.6986111111111111 | 228.436 |
| 0.6993055555555556 | 219.309 |
| 0.7000000000000001 | 210.182 |
| 0.7006944444444444 | 205.62 |
| 0.7013888888888888 | 205.62 |
| 0.7020833333333334 | 205.62 |
| 0.7027777777777778 | 201.058 |
| 0.7034722222222222 | 205.62 |
| 0.7041666666666666 | 205.62 |
| 0.7048611111111112 | 205.62 |
| 0.7055555555555556 | 205.62 |
| 0.7062499999999999 | 196.497 |
| 0.7069444444444444 | 201.058 |
| 0.7076388888888889 | 210.182 |
| 0.7083333333333334 | 214.746 |
| 0.7090277777777777 | 219.309 |
| 0.7097222222222223 | 219.309 |
| 0.7104166666666667 | 223.873 |
| 0.7111111111111111 | 223.873 |
| 0.7118055555555555 | 223.873 |
| 0.7125 | 219.309 |
| 0.7131944444444445 | 214.746 |
| 0.7138888888888889 | 219.309 |
| 0.7145833333333332 | 214.746 |
| 0.7152777777777778 | 205.62 |
| 0.7159722222222222 | 205.62 |
| 0.7166666666666667 | 210.182 |
| 0.717361111111111 | 210.182 |
| 0.7180555555555556 | 210.182 |
| 0.71875 | 210.182 |
| 0.7194444444444444 | 196.497 |
| 0.720138888888889 | 191.937 |
| 0.7208333333333333 | 187.378 |
| 0.7215277777777778 | 201.058 |
| 0.7222222222222222 | 196.497 |
| 0.7229166666666668 | 191.937 |
| 0.7236111111111111 | 182.82 |
| 0.7243055555555555 | 178.264 |
| 0.725 | 178.264 |
| 0.7256944444444445 | 182.82 |
| 0.7263888888888889 | 187.378 |
| 0.7270833333333333 | 191.937 |
| 0.7277777777777777 | 191.937 |
| 0.7284722222222223 | 191.937 |
| 0.7291666666666666 | 191.937 |
| 0.7298611111111111 | 191.937 |
| 0.7305555555555556 | 187.378 |
| 0.7312500000000001 | 187.378 |
| 0.7319444444444444 | 191.937 |
| 0.7326388888888888 | 191.937 |
| 0.7333333333333334 | 191.937 |
| 0.7340277777777778 | 191.937 |
| 0.7347222222222222 | 191.937 |
| 0.7354166666666666 | 182.82 |
| 0.7361111111111112 | 173.709 |
| 0.7368055555555556 | 173.709 |
| 0.7374999999999999 | 173.709 |
| 0.7381944444444444 | 160.056 |
| 0.7388888888888889 | 137.347 |
| 0.7395833333333334 | 137.347 |
| 0.7402777777777777 | 132.814 |
| 0.7409722222222223 | 123.758 |
| 0.7416666666666667 | 128.284 |
| 0.7423611111111111 | 128.284 |
| 0.7430555555555555 | 123.758 |
| 0.74375 | 110.201 |
| 0.7444444444444445 | 101.184 |
| 0.7451388888888889 | 96.682 |
| 0.7458333333333332 | 101.184 |
| 0.7465277777777778 | 96.682 |
| 0.7472222222222222 | 92.184 |
| 0.7479166666666667 | 87.692 |
| 0.748611111111111 | 83.205 |
| 0.7493055555555556 | 87.692 |
| 0.75 | 87.692 |
| 0.7506944444444444 | 96.682 |
| 0.751388888888889 | 96.682 |
| 0.7520833333333333 | 101.184 |
| 0.7527777777777778 | 83.205 |
| 0.7534722222222222 | 83.205 |
| 0.7541666666666668 | 87.692 |
| 0.7548611111111111 | 83.205 |
| 0.7555555555555555 | 78.722 |
| 0.75625 | 83.205 |
| 0.7569444444444445 | 92.184 |
| 0.7576388888888889 | 83.205 |
| 0.7583333333333333 | 78.722 |
| 0.7590277777777777 | 78.722 |
| 0.7597222222222223 | 78.722 |
| 0.7604166666666666 | 74.246 |
| 0.7611111111111111 | 74.246 |
| 0.7618055555555556 | 69.775 |
| 0.7625000000000001 | 65.31 |
| 0.7631944444444444 | 65.31 |
| 0.7638888888888888 | 65.31 |
| 0.7645833333333334 | 65.31 |
| 0.7652777777777778 | 65.31 |
| 0.7659722222222222 | 65.31 |
| 0.7666666666666666 | 65.31 |
| 0.7673611111111112 | 65.31 |
| 0.7680555555555556 | 65.31 |
| 0.7687499999999999 | 65.31 |
| 0.7694444444444444 | 65.31 |
| 0.7701388888888889 | 69.775 |
| 0.7708333333333334 | 69.775 |
| 0.7715277777777777 | 69.775 |
| 0.7722222222222223 | 74.246 |
| 0.7729166666666667 | 78.722 |
| 0.7736111111111111 | 74.246 |
| 0.7743055555555555 | 69.775 |
| 0.775 | 74.246 |
| 0.7756944444444445 | 74.246 |
| 0.7763888888888889 | 74.246 |
| 0.7770833333333332 | 65.31 |
| 0.7777777777777778 | 65.31 |
| 0.7784722222222222 | 60.85 |
| 0.7791666666666667 | 60.85 |
| 0.779861111111111 | 60.85 |
| 0.7805555555555556 | 56.398 |
| 0.78125 | 56.398 |
| 0.7819444444444444 | 56.398 |
| 0.782638888888889 | 60.85 |
| 0.7833333333333333 | 65.31 |
| 0.7840277777777778 | 78.722 |
| 0.7847222222222222 | 78.722 |
| 0.7854166666666668 | 78.722 |
| 0.7861111111111111 | 74.246 |
| 0.7868055555555555 | 65.31 |
| 0.7875 | 65.31 |
| 0.7881944444444445 | 74.246 |
| 0.7888888888888889 | 74.246 |
| 0.7895833333333333 | 74.246 |
| 0.7902777777777777 | 69.775 |
| 0.7909722222222223 | 74.246 |
| 0.7916666666666666 | 65.31 |
| 0.7923611111111111 | 60.85 |
| 0.7930555555555556 | 60.85 |
| 0.7937500000000001 | 56.398 |
| 0.7944444444444444 | 56.398 |
| 0.7951388888888888 | 51.951 |
| 0.7958333333333334 | 51.951 |
| 0.7965277777777778 | 51.951 |
| 0.7972222222222222 | 51.951 |
| 0.7979166666666666 | 51.951 |
| 0.7986111111111112 | 51.951 |
| 0.7993055555555556 | 51.951 |
| 0.7999999999999999 | 51.951 |
| 0.8006944444444444 | 51.951 |
| 0.8013888888888889 | 51.951 |
| 0.8020833333333334 | 56.398 |
| 0.8027777777777777 | 56.398 |
| 0.8034722222222223 | 51.951 |
| 0.8041666666666667 | 51.951 |
| 0.8048611111111111 | 51.951 |
| 0.8055555555555555 | 51.951 |
| 0.80625 | 51.951 |
| 0.8069444444444445 | 51.951 |
| 0.8076388888888889 | 51.951 |
| 0.8083333333333332 | 56.398 |
| 0.8090277777777778 | 56.398 |
| 0.8097222222222222 | 56.398 |
| 0.8104166666666667 | 56.398 |
| 0.811111111111111 | 56.398 |
| 0.8118055555555556 | 56.398 |
| 0.8125 | 56.398 |
| 0.8131944444444444 | 56.398 |
| 0.813888888888889 | 51.951 |
| 0.8145833333333333 | 51.951 |
| 0.8152777777777778 | 51.951 |
| 0.8159722222222222 | 51.951 |
| 0.8166666666666668 | 51.951 |
| 0.8173611111111111 | 51.951 |
| 0.8180555555555555 | 47.511 |
| 0.81875 | 47.511 |
| 0.8194444444444445 | 47.511 |
| 0.8201388888888889 | 43.079 |
| 0.8208333333333333 | 43.079 |
| 0.8215277777777777 | 43.079 |
| 0.8222222222222223 | 38.653 |
| 0.8229166666666666 | 38.653 |
| 0.8236111111111111 | 38.653 |
| 0.8243055555555556 | 38.653 |
| 0.8250000000000001 | 38.653 |
| 0.8256944444444444 | 38.653 |
| 0.8263888888888888 | 38.653 |
| 0.8270833333333334 | 38.653 |
| 0.8277777777777778 | 34.234 |
| 0.8284722222222222 | 34.234 |
| 0.8291666666666666 | 34.234 |
| 0.8298611111111112 | 34.234 |
| 0.8305555555555556 | 29.823 |
| 0.8312499999999999 | 29.823 |
| 0.8319444444444444 | 29.823 |
| 0.8326388888888889 | 29.823 |
| 0.8333333333333334 | 29.823 |
| 0.8340277777777777 | 29.823 |
| 0.8347222222222223 | 25.419 |
| 0.8354166666666667 | 25.419 |
| 0.8361111111111111 | 25.419 |
| 0.8368055555555555 | 25.419 |
| 0.8375 | 21.024 |
| 0.8381944444444445 | 21.024 |
| 0.8388888888888889 | 21.024 |
| 0.8395833333333332 | 21.024 |
| 0.8402777777777778 | 16.636 |
| 0.8409722222222222 | 16.636 |
| 0.8416666666666667 | 16.636 |
| 0.842361111111111 | 16.636 |
| 0.8430555555555556 | 16.636 |
| 0.84375 | 12.257 |
| 0.8444444444444444 | 12.257 |
| 0.845138888888889 | 12.257 |
| 0.8458333333333333 | 12.257 |
| 0.8465277777777778 | 12.257 |
| 0.8472222222222222 | 12.257 |
| 0.8479166666666668 | 7.887 |
| 0.8486111111111111 | 7.887 |
| 0.8493055555555555 | 7.887 |
| 0.85 | 7.887 |
| 0.8506944444444445 | 3.525 |
| 0.8513888888888889 | 3.525 |
| 0.8520833333333333 | 3.525 |
| 0.8527777777777777 | 3.525 |
| 0.8534722222222223 | 3.525 |
| 0.8541666666666666 | 3.525 |
| 0.8548611111111111 | 0 |
| 0.8555555555555556 | 0 |
| 0.8562500000000001 | 0 |
| 0.8569444444444444 | 0 |
| 0.8576388888888888 | 0 |
| 0.8583333333333334 | 0 |
| 0.8590277777777778 | 0 |
| 0.8597222222222222 | 0 |
| 0.8604166666666666 | 0 |
| 0.8611111111111112 | 0 |
| 0.8618055555555556 | 0 |
| 0.8624999999999999 | 0 |
| 0.8631944444444444 | 0 |
| 0.8638888888888889 | 0 |
| 0.8645833333333334 | 0 |
| 0.8652777777777777 | 0 |
| 0.8659722222222223 | 0 |
| 0.8666666666666667 | 0 |
| 0.8673611111111111 | 0 |
| 0.8680555555555555 | 0 |
| 0.86875 | 0 |
| 0.8694444444444445 | 0 |
| 0.8701388888888889 | 0 |
| 0.8708333333333332 | 0 |
| 0.8715277777777778 | 0 |
| 0.8722222222222222 | 0 |
| 0.8729166666666667 | 0 |
| 0.873611111111111 | 0 |
| 0.8743055555555556 | 0 |
| 0.875 | 0 |
| 0.8756944444444444 | 0 |
| 0.876388888888889 | 0 |
| 0.8770833333333333 | 0 |
| 0.8777777777777778 | 0 |
| 0.8784722222222222 | 0 |
| 0.8791666666666668 | 0 |
| 0.8798611111111111 | 0 |
| 0.8805555555555555 | 0 |
| 0.88125 | 0 |
| 0.8819444444444445 | 0 |
| 0.8826388888888889 | 0 |
| 0.8833333333333333 | 0 |
| 0.8840277777777777 | 0 |
| 0.8847222222222223 | 0 |
| 0.8854166666666666 | 0 |
| 0.8861111111111111 | 0 |
| 0.8868055555555556 | 0 |
| 0.8875000000000001 | 0 |
| 0.8881944444444444 | 0 |
| 0.8888888888888888 | 0 |
| 0.8895833333333334 | 0 |
| 0.8902777777777778 | 0 |
| 0.8909722222222222 | 0 |
| 0.8916666666666666 | 0 |
| 0.8923611111111112 | 0 |
| 0.8930555555555556 | 0 |
| 0.8937499999999999 | 0 |
| 0.8944444444444444 | 0 |
| 0.8951388888888889 | 0 |
| 0.8958333333333334 | 0 |
| 0.8965277777777777 | 0 |
| 0.8972222222222223 | 0 |
| 0.8979166666666667 | 0 |
| 0.8986111111111111 | 0 |
| 0.8993055555555555 | 0 |
| 0.9 | 0 |
| 0.9006944444444445 | 0 |
| 0.9013888888888889 | 0 |
| 0.9020833333333332 | 0 |
| 0.9027777777777778 | 0 |
| 0.9034722222222222 | 0 |
| 0.9041666666666667 | 0 |
| 0.904861111111111 | 0 |
| 0.9055555555555556 | 0 |
| 0.90625 | 0 |
| 0.9069444444444444 | 0 |
| 0.907638888888889 | 0 |
| 0.9083333333333333 | 0 |
| 0.9090277777777778 | 0 |
| 0.9097222222222222 | 0 |
| 0.9104166666666668 | 0 |
| 0.9111111111111111 | 0 |
| 0.9118055555555555 | 0 |
| 0.9125 | 0 |
| 0.9131944444444445 | 0 |
| 0.9138888888888889 | 0 |
| 0.9145833333333333 | 0 |
| 0.9152777777777777 | 0 |
| 0.9159722222222223 | 0 |
| 0.9166666666666666 | 0 |
| 0.9173611111111111 | 0 |
| 0.9180555555555556 | 0 |
| 0.9187500000000001 | 0 |
| 0.9194444444444444 | 0 |
| 0.9201388888888888 | 0 |
| 0.9208333333333334 | 0 |
| 0.9215277777777778 | 0 |
| 0.9222222222222222 | 0 |
| 0.9229166666666666 | 0 |
| 0.9236111111111112 | 0 |
| 0.9243055555555556 | 0 |
| 0.9249999999999999 | 0 |
| 0.9256944444444444 | 0 |
| 0.9263888888888889 | 0 |
| 0.9270833333333334 | 0 |
| 0.9277777777777777 | 0 |
| 0.9284722222222223 | 0 |
| 0.9291666666666667 | 0 |
| 0.9298611111111111 | 0 |
| 0.9305555555555555 | 0 |
| 0.93125 | 0 |
| 0.9319444444444445 | 0 |
| 0.9326388888888889 | 0 |
| 0.9333333333333332 | 0 |
| 0.9340277777777778 | 0 |
| 0.9347222222222222 | 0 |
| 0.9354166666666667 | 0 |
| 0.936111111111111 | 0 |
| 0.9368055555555556 | 0 |
| 0.9375 | 0 |
| 0.9381944444444444 | 0 |
| 0.938888888888889 | 0 |
| 0.9395833333333333 | 0 |
| 0.9402777777777778 | 0 |
| 0.9409722222222222 | 0 |
| 0.9416666666666668 | 0 |
| 0.9423611111111111 | 0 |
| 0.9430555555555555 | 0 |
| 0.94375 | 0 |
| 0.9444444444444445 | 0 |
| 0.9451388888888889 | 0 |
| 0.9458333333333333 | 0 |
| 0.9465277777777777 | 0 |
| 0.9472222222222223 | 0 |
| 0.9479166666666666 | 0 |
| 0.9486111111111111 | 0 |
| 0.9493055555555556 | 0 |
| 0.9500000000000001 | 0 |
| 0.9506944444444444 | 0 |
| 0.9513888888888888 | 0 |
| 0.9520833333333334 | 0 |
| 0.9527777777777778 | 0 |
| 0.9534722222222222 | 0 |
| 0.9541666666666666 | 0 |
| 0.9548611111111112 | 0 |
| 0.9555555555555556 | 0 |
| 0.9562499999999999 | 0 |
| 0.9569444444444444 | 0 |
| 0.9576388888888889 | 0 |
| 0.9583333333333334 | 0 |
| 0.9590277777777777 | 0 |
| 0.9597222222222223 | 0 |
| 0.9604166666666667 | 0 |
| 0.9611111111111111 | 0 |
| 0.9618055555555555 | 0 |
| 0.9625 | 0 |
| 0.9631944444444445 | 0 |
| 0.9638888888888889 | 0 |
| 0.9645833333333332 | 0 |
| 0.9652777777777778 | 0 |
| 0.9659722222222222 | 0 |
| 0.9666666666666667 | 0 |
| 0.967361111111111 | 0 |
| 0.9680555555555556 | 0 |
| 0.96875 | 0 |
| 0.9694444444444444 | 0 |
| 0.970138888888889 | 0 |
| 0.9708333333333333 | 0 |
| 0.9715277777777778 | 0 |
| 0.9722222222222222 | 0 |
| 0.9729166666666668 | 0 |
| 0.9736111111111111 | 0 |
| 0.9743055555555555 | 0 |
| 0.975 | 0 |
| 0.9756944444444445 | 0 |
| 0.9763888888888889 | 0 |
| 0.9770833333333333 | 0 |
| 0.9777777777777777 | 0 |
| 0.9784722222222223 | 0 |
| 0.9791666666666666 | 0 |
| 0.9798611111111111 | 0 |
| 0.9805555555555556 | 0 |
| 0.9812500000000001 | 0 |
| 0.9819444444444444 | 0 |
| 0.9826388888888888 | 0 |
| 0.9833333333333334 | 0 |
| 0.9840277777777778 | 0 |
| 0.9847222222222222 | 0 |
| 0.9854166666666666 | 0 |
| 0.9861111111111112 | 0 |
| 0.9868055555555556 | 0 |
| 0.9874999999999999 | 0 |
| 0.9881944444444444 | 0 |
| 0.9888888888888889 | 0 |
| 0.9895833333333334 | 0 |
| 0.9902777777777777 | 0 |
| 0.9909722222222223 | 0 |
| 0.9916666666666667 | 0 |
| 0.9923611111111111 | 0 |
| 0.9930555555555555 | 0 |
| 0.99375 | 0 |
| 0.9944444444444445 | 0 |
| 0.9951388888888889 | 0 |
| 0.9958333333333332 | 0 |
| 0.9965277777777778 | 0 |
| 0.9972222222222222 | 0 |
| 0.9979166666666667 | 0 |
| 0.998611111111111 | 0 |
| 0.9993055555555556 | 0 |